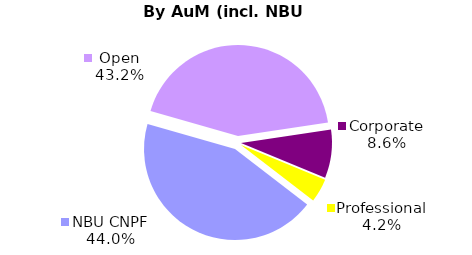
| Category | Series 0 |
|---|---|
| Open | 1635.937 |
| Corporate | 324.853 |
| Professional | 158.899 |
| NBU CNPF | 1666.776 |